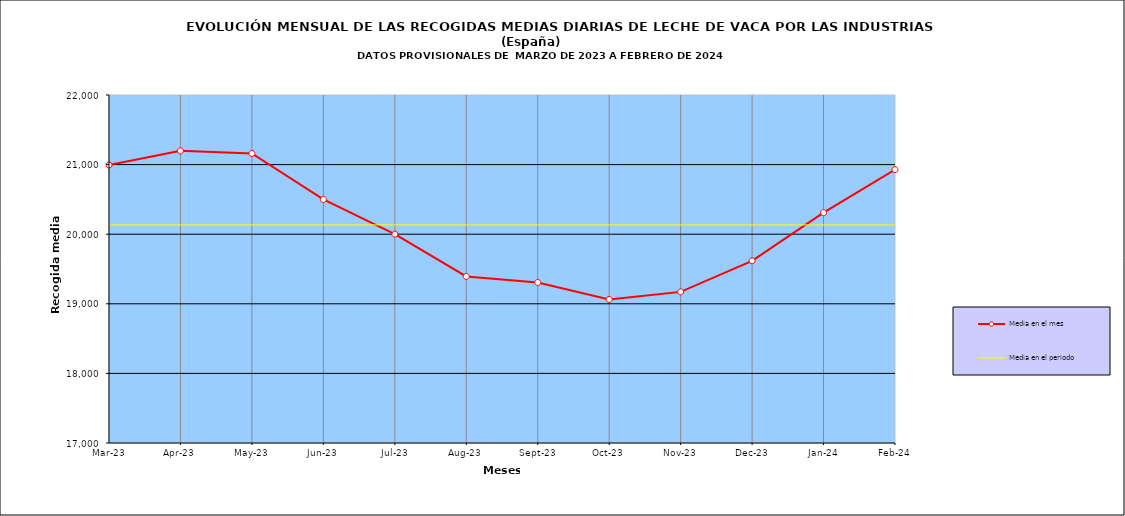
| Category | Media en el mes | Media en el periodo |
|---|---|---|
| 2023-03-01 | 20994.613 | 20133.478 |
| 2023-04-01 | 21197.267 | 20133.478 |
| 2023-05-01 | 21159.71 | 20133.478 |
| 2023-06-01 | 20499.167 | 20133.478 |
| 2023-07-01 | 20001.387 | 20133.478 |
| 2023-08-01 | 19393.581 | 20133.478 |
| 2023-09-01 | 19306.433 | 20133.478 |
| 2023-10-01 | 19063.323 | 20133.478 |
| 2023-11-01 | 19171.367 | 20133.478 |
| 2023-12-01 | 19617.903 | 20133.478 |
| 2024-01-01 | 20309.806 | 20133.478 |
| 2024-02-01 | 20926.759 | 20133.478 |